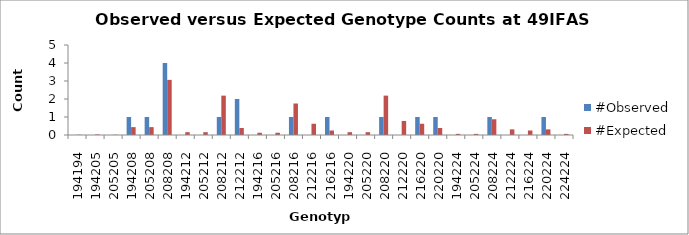
| Category | #Observed | #Expected |
|---|---|---|
| 194194.0 | 0 | 0.016 |
| 194205.0 | 0 | 0.031 |
| 205205.0 | 0 | 0.016 |
| 194208.0 | 1 | 0.438 |
| 205208.0 | 1 | 0.438 |
| 208208.0 | 4 | 3.062 |
| 194212.0 | 0 | 0.156 |
| 205212.0 | 0 | 0.156 |
| 208212.0 | 1 | 2.188 |
| 212212.0 | 2 | 0.391 |
| 194216.0 | 0 | 0.125 |
| 205216.0 | 0 | 0.125 |
| 208216.0 | 1 | 1.75 |
| 212216.0 | 0 | 0.625 |
| 216216.0 | 1 | 0.25 |
| 194220.0 | 0 | 0.156 |
| 205220.0 | 0 | 0.156 |
| 208220.0 | 1 | 2.188 |
| 212220.0 | 0 | 0.781 |
| 216220.0 | 1 | 0.625 |
| 220220.0 | 1 | 0.391 |
| 194224.0 | 0 | 0.062 |
| 205224.0 | 0 | 0.062 |
| 208224.0 | 1 | 0.875 |
| 212224.0 | 0 | 0.312 |
| 216224.0 | 0 | 0.25 |
| 220224.0 | 1 | 0.312 |
| 224224.0 | 0 | 0.062 |